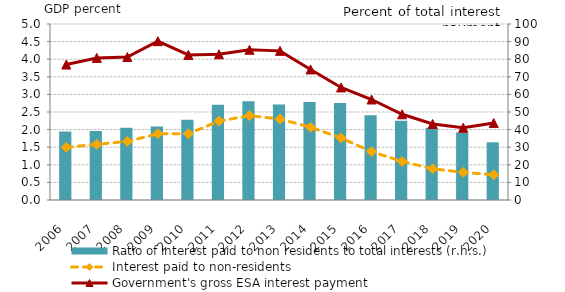
| Category | Ratio of interest paid to non residents to total interests (r.h.s.) |
|---|---|
| 2006.0 | 38.868 |
| 2007.0 | 39.182 |
| 2008.0 | 40.993 |
| 2009.0 | 41.71 |
| 2010.0 | 45.623 |
| 2011.0 | 54.152 |
| 2012.0 | 56.147 |
| 2013.0 | 54.323 |
| 2014.0 | 55.712 |
| 2015.0 | 55.056 |
| 2016.0 | 48.085 |
| 2017.0 | 44.995 |
| 2018.0 | 41.036 |
| 2019.0 | 38.342 |
| 2020.0 | 32.781 |